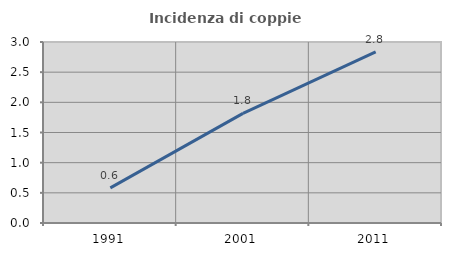
| Category | Incidenza di coppie miste |
|---|---|
| 1991.0 | 0.582 |
| 2001.0 | 1.816 |
| 2011.0 | 2.837 |